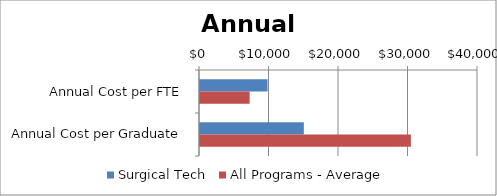
| Category | Surgical Tech | All Programs - Average |
|---|---|---|
| Annual Cost per FTE | 9717.316 | 7144 |
| Annual Cost per Graduate | 14940.374 | 30340 |